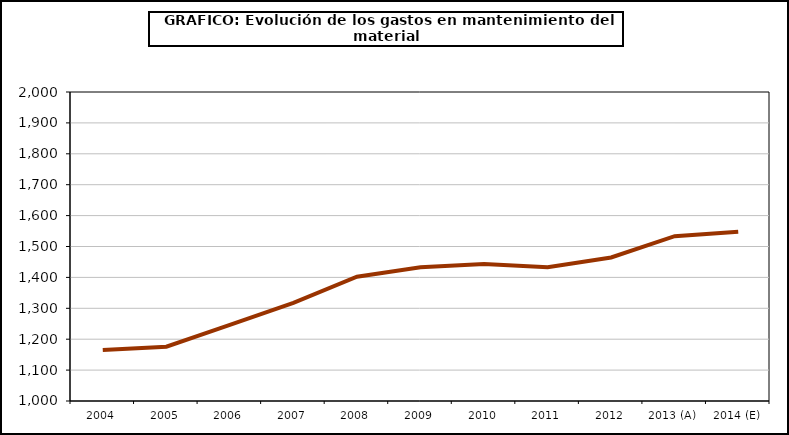
| Category | producción |
|---|---|
| 2004 | 1164.659 |
| 2005 | 1175.74 |
| 2006 | 1246.057 |
| 2007 | 1317.25 |
| 2008 | 1402.028 |
| 2009 | 1432.557 |
| 2010 | 1443.194 |
| 2011 | 1432.619 |
| 2012 | 1464.429 |
| 2013 (A) | 1533.461 |
| 2014 (E) | 1547.821 |